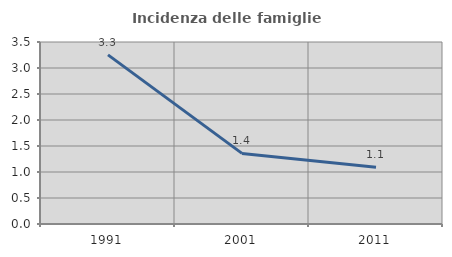
| Category | Incidenza delle famiglie numerose |
|---|---|
| 1991.0 | 3.252 |
| 2001.0 | 1.357 |
| 2011.0 | 1.093 |